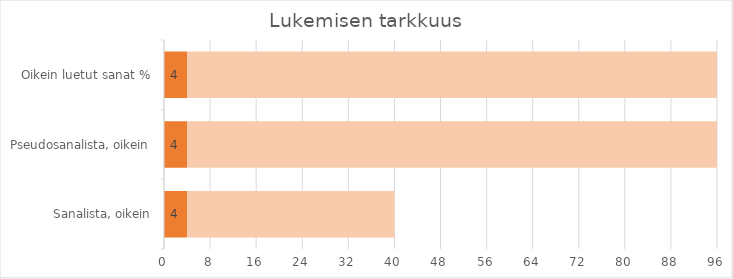
| Category | Series 0 | 36 |
|---|---|---|
| Sanalista, oikein | 4 | 36 |
| Pseudosanalista, oikein | 4 | 92 |
| Oikein luetut sanat % | 4 | 92 |